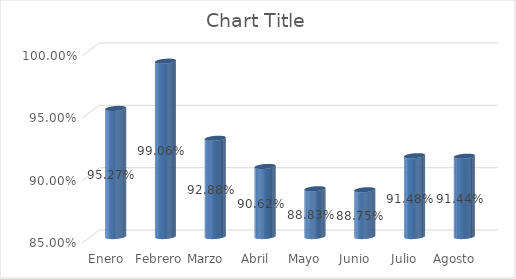
| Category | Series 0 |
|---|---|
| Enero | 0.953 |
| Febrero | 0.991 |
| Marzo | 0.929 |
| Abril | 0.906 |
| Mayo | 0.888 |
| Junio | 0.888 |
| Julio | 0.915 |
| Agosto | 0.914 |